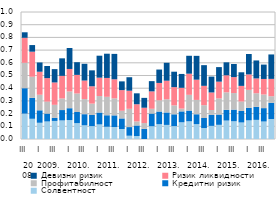
| Category | Солвентност | Кредитни ризик | Профитабилност | Ризик ликвидности | Девизни ризик |
|---|---|---|---|---|---|
| 0 | 0.2 | 0.2 | 0.2 | 0.197 | 0.043 |
| 1 | 0.159 | 0.165 | 0.166 | 0.197 | 0.052 |
| 2 | 0.128 | 0.098 | 0.123 | 0.181 | 0.073 |
| 3 | 0.138 | 0.062 | 0.094 | 0.185 | 0.095 |
| 4 | 0.142 | 0.024 | 0.103 | 0.176 | 0.105 |
| 5 | 0.146 | 0.082 | 0.091 | 0.178 | 0.138 |
| 6 | 0.149 | 0.094 | 0.132 | 0.177 | 0.165 |
| 7 | 0.125 | 0.087 | 0.146 | 0.146 | 0.1 |
| 8 | 0.108 | 0.087 | 0.119 | 0.146 | 0.132 |
| 9 | 0.102 | 0.087 | 0.089 | 0.137 | 0.125 |
| 10 | 0.115 | 0.093 | 0.13 | 0.145 | 0.173 |
| 11 | 0.097 | 0.09 | 0.145 | 0.149 | 0.191 |
| 12 | 0.094 | 0.092 | 0.134 | 0.15 | 0.2 |
| 13 | 0.079 | 0.083 | 0.06 | 0.163 | 0.069 |
| 14 | 0.026 | 0.068 | 0.144 | 0.143 | 0.106 |
| 15 | 0.023 | 0.083 | 0.032 | 0.135 | 0.086 |
| 16 | 0 | 0.08 | 0.046 | 0.121 | 0.078 |
| 17 | 0.101 | 0.099 | 0.038 | 0.137 | 0.081 |
| 18 | 0.117 | 0.1 | 0.088 | 0.137 | 0.106 |
| 19 | 0.111 | 0.098 | 0.104 | 0.146 | 0.141 |
| 20 | 0.102 | 0.093 | 0.07 | 0.144 | 0.121 |
| 21 | 0.132 | 0.086 | 0.022 | 0.164 | 0.109 |
| 22 | 0.139 | 0.084 | 0.124 | 0.167 | 0.141 |
| 23 | 0.117 | 0.078 | 0.113 | 0.159 | 0.188 |
| 24 | 0.086 | 0.079 | 0.101 | 0.152 | 0.163 |
| 25 | 0.103 | 0.086 | 0.039 | 0.138 | 0.125 |
| 26 | 0.112 | 0.081 | 0.127 | 0.132 | 0.115 |
| 27 | 0.145 | 0.084 | 0.138 | 0.134 | 0.102 |
| 28 | 0.14 | 0.092 | 0.13 | 0.126 | 0.103 |
| 29 | 0.13 | 0.091 | 0.075 | 0.123 | 0.107 |
| 30 | 0.147 | 0.099 | 0.141 | 0.122 | 0.16 |
| 31 | 0.151 | 0.103 | 0.107 | 0.117 | 0.142 |
| 32 | 0.138 | 0.105 | 0.107 | 0.122 | 0.113 |
| 33 | 0.158 | 0.128 | 0.051 | 0.137 | 0.192 |